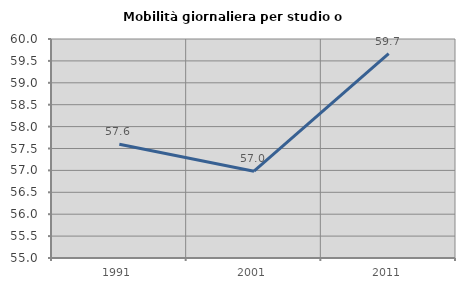
| Category | Mobilità giornaliera per studio o lavoro |
|---|---|
| 1991.0 | 57.598 |
| 2001.0 | 56.982 |
| 2011.0 | 59.666 |